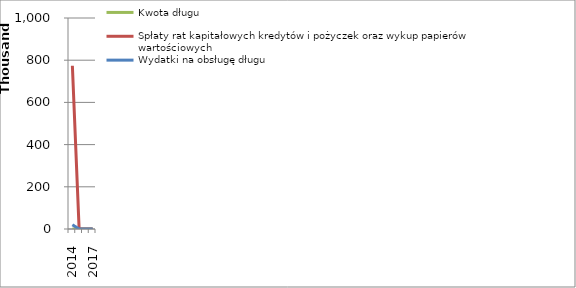
| Category | Kwota długu | Spłaty rat kapitałowych kredytów i pożyczek oraz wykup papierów wartościowych | Wydatki na obsługę długu |
|---|---|---|---|
| 2014.0 | 0 | 773956.19 | 20000 |
| 2015.0 | 0 | 0 | 0 |
| 2016.0 | 0 | 0 | 0 |
| 2017.0 | 0 | 0 | 0 |